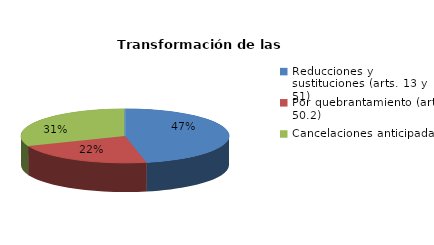
| Category | Series 0 |
|---|---|
| Reducciones y sustituciones (arts. 13 y 51) | 78 |
| Por quebrantamiento (art. 50.2) | 37 |
| Cancelaciones anticipadas | 52 |
| Traslado a Centros Penitenciarios | 0 |
| Conversión internamientos en cerrados (art. 51.2) | 0 |